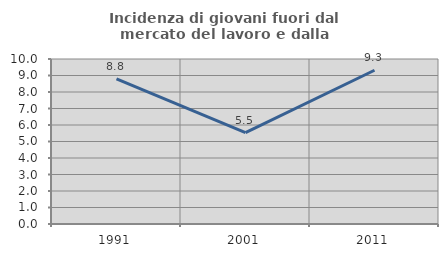
| Category | Incidenza di giovani fuori dal mercato del lavoro e dalla formazione  |
|---|---|
| 1991.0 | 8.802 |
| 2001.0 | 5.533 |
| 2011.0 | 9.317 |